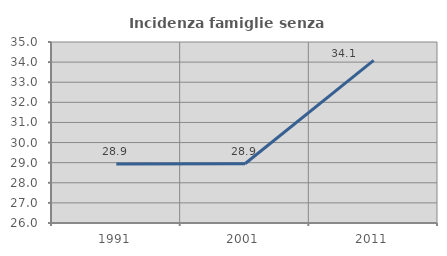
| Category | Incidenza famiglie senza nuclei |
|---|---|
| 1991.0 | 28.934 |
| 2001.0 | 28.947 |
| 2011.0 | 34.089 |